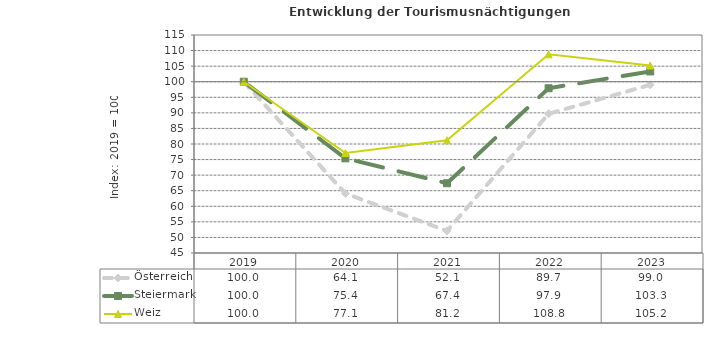
| Category | Österreich | Steiermark | Weiz |
|---|---|---|---|
| 2023.0 | 99 | 103.3 | 105.2 |
| 2022.0 | 89.7 | 97.9 | 108.8 |
| 2021.0 | 52.1 | 67.4 | 81.2 |
| 2020.0 | 64.1 | 75.4 | 77.1 |
| 2019.0 | 100 | 100 | 100 |